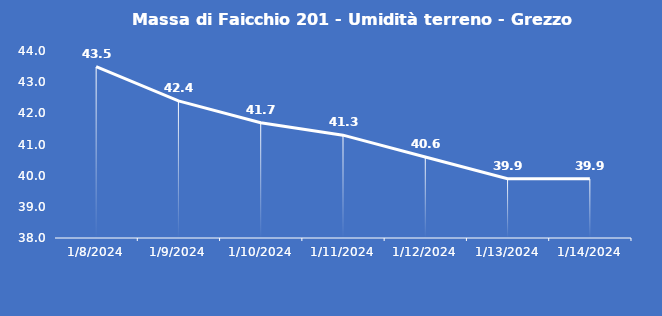
| Category | Massa di Faicchio 201 - Umidità terreno - Grezzo (%VWC) |
|---|---|
| 1/8/24 | 43.5 |
| 1/9/24 | 42.4 |
| 1/10/24 | 41.7 |
| 1/11/24 | 41.3 |
| 1/12/24 | 40.6 |
| 1/13/24 | 39.9 |
| 1/14/24 | 39.9 |